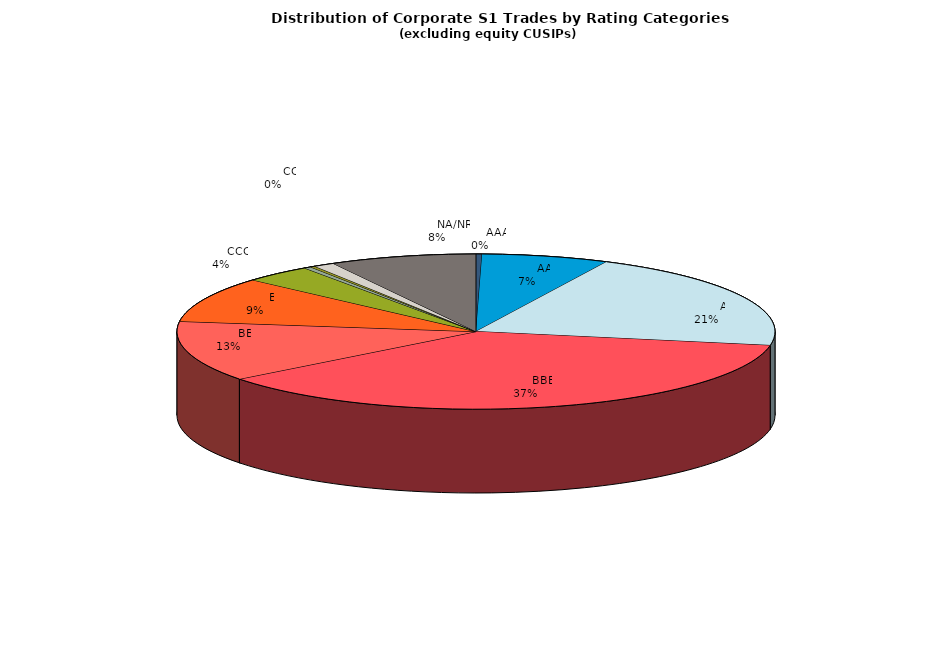
| Category | Series 0 |
|---|---|
|         AAA | 169.742 |
|         AA | 3593.825 |
|         A | 10800.651 |
|         BBB | 19166.31 |
|         BB | 6576.579 |
|         B | 4959.345 |
|         CCC | 1928.23 |
|         CC | 203.405 |
|         C | 136.972 |
|         D | 596.532 |
|         NA/NR | 4142.881 |